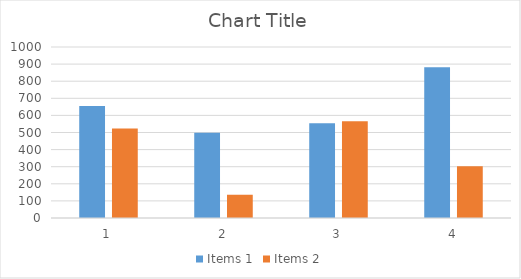
| Category | Items 1 | Items 2 |
|---|---|---|
| 0 | 655 | 523 |
| 1 | 498 | 136 |
| 2 | 554 | 566 |
| 3 | 882 | 302 |